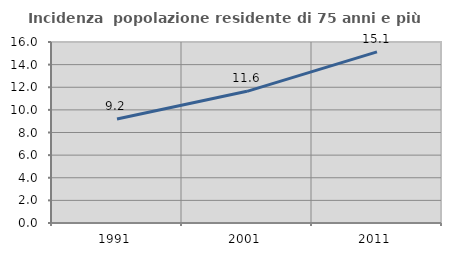
| Category | Incidenza  popolazione residente di 75 anni e più |
|---|---|
| 1991.0 | 9.193 |
| 2001.0 | 11.639 |
| 2011.0 | 15.13 |